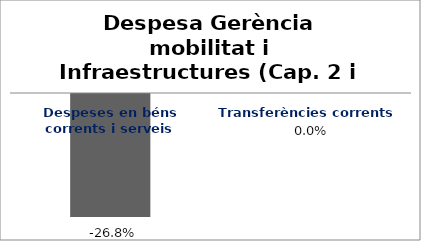
| Category | Series 0 |
|---|---|
| Despeses en béns corrents i serveis | -0.268 |
| Transferències corrents | 0 |